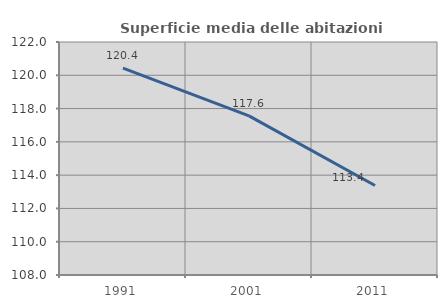
| Category | Superficie media delle abitazioni occupate |
|---|---|
| 1991.0 | 120.428 |
| 2001.0 | 117.559 |
| 2011.0 | 113.378 |